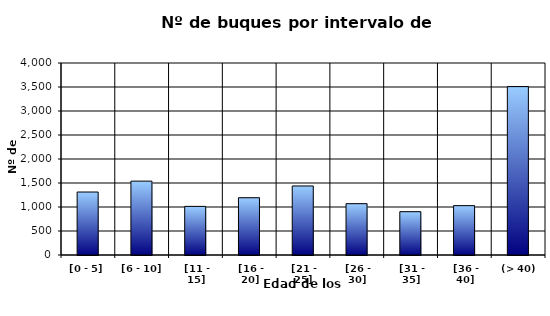
| Category | [0 - 5] |
|---|---|
| [0 - 5] | 1312 |
|  [6 - 10] | 1539 |
|  [11 - 15] | 1013 |
|  [16 - 20] | 1193 |
|  [21 - 25] | 1438 |
|  [26 - 30] | 1069 |
|  [31 - 35] | 902 |
|  [36 - 40] | 1028 |
|  (> 40) | 3508 |